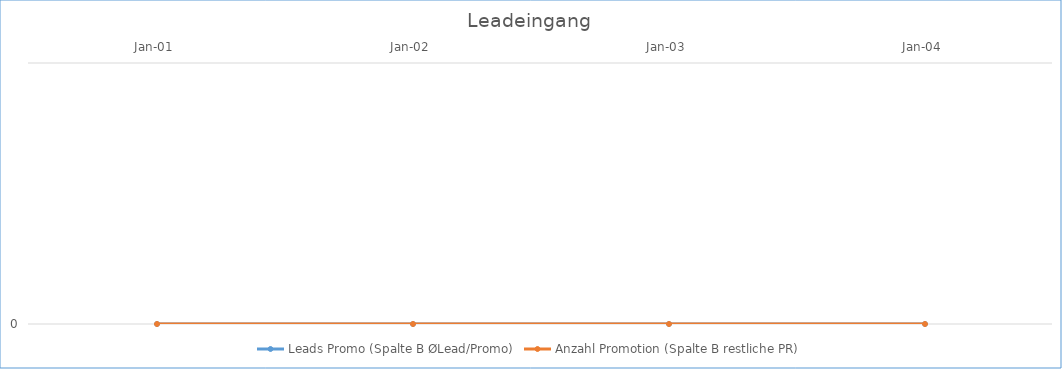
| Category | Leads Promo (Spalte B ØLead/Promo) | Anzahl Promotion (Spalte B restliche PR) |
|---|---|---|
| 2001-01-01 | 0 | 0 |
| 2002-01-01 | 0 | 0 |
| 2003-01-01 | 0 | 0 |
| 2004-01-01 | 0 | 0 |